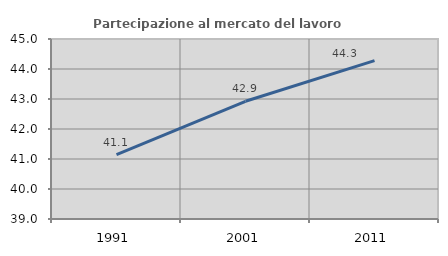
| Category | Partecipazione al mercato del lavoro  femminile |
|---|---|
| 1991.0 | 41.143 |
| 2001.0 | 42.924 |
| 2011.0 | 44.281 |